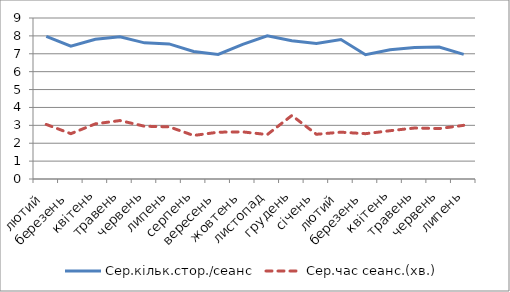
| Category | Сер.кільк.стор./сеанс | Сер.час сеанс.(хв.) |
|---|---|---|
| лютий | 7.97 | 3.05 |
| березень | 7.42 | 2.533 |
| квітень | 7.81 | 3.083 |
| травень | 7.95 | 3.267 |
| червень | 7.61 | 2.95 |
| липень | 7.55 | 2.917 |
| серпень | 7.13 | 2.433 |
| вересень | 6.96 | 2.617 |
| жовтень | 7.53 | 2.633 |
| листопад | 8.01 | 2.483 |
| грудень | 7.73 | 3.55 |
| січень | 7.58 | 2.5 |
| лютий | 7.8 | 2.617 |
| березень | 6.95 | 2.533 |
| квітень | 7.23 | 2.7 |
| травень | 7.35 | 2.85 |
| червень | 7.38 | 2.817 |
| липень | 6.97 | 3 |